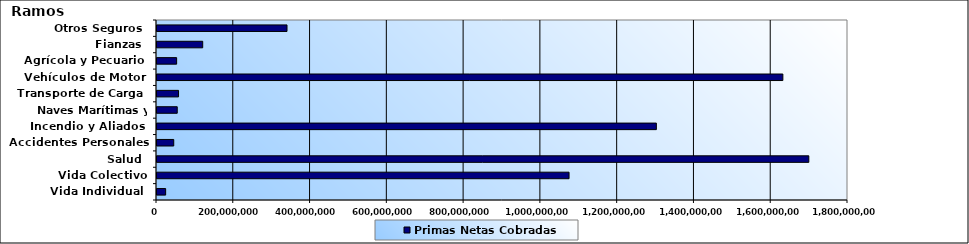
| Category | Primas Netas Cobradas |
|---|---|
| Vida Individual  | 22537593.89 |
| Vida Colectivo | 1073382421.13 |
| Salud  | 1697958034.14 |
| Accidentes Personales | 43615771.36 |
| Incendio y Aliados  | 1300820484.33 |
| Naves Marítimas y Aéreas  | 52713976.52 |
| Transporte de Carga  | 56119018.39 |
| Vehículos de Motor  | 1630339617.23 |
| Agrícola y Pecuario  | 51151066.21 |
| Fianzas  | 119055243.57 |
| Otros Seguros  | 338646033.64 |